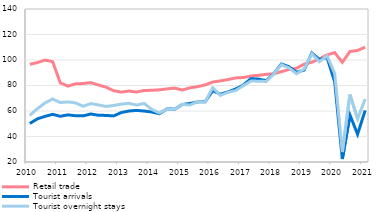
| Category | Retail trade  | Tourist arrivals  | Tourist overnight stays  |
|---|---|---|---|
| 2010 | 96.647 | 50.221 | 56.611 |
| II | 97.979 | 53.848 | 61.89 |
| III | 99.953 | 55.818 | 66.339 |
| IV | 98.675 | 57.383 | 69.417 |
| 2011 | 82.065 | 55.872 | 66.617 |
| II | 79.506 | 56.975 | 67.135 |
| III | 81.313 | 56.277 | 66.349 |
| IV | 81.537 | 56.193 | 63.741 |
| 2012 | 82.245 | 57.646 | 65.806 |
| II | 80.392 | 56.675 | 64.748 |
| III | 78.676 | 56.525 | 63.57 |
| IV | 75.906 | 56.144 | 64.34 |
| 2013 | 74.806 | 58.784 | 65.396 |
| II | 75.658 | 59.991 | 66.041 |
| III | 74.888 | 60.471 | 64.66 |
| IV | 76.086 | 59.97 | 65.949 |
| 2014 | 76.235 | 59.201 | 61.238 |
| II | 76.606 | 57.898 | 58.474 |
| III | 77.333 | 61.576 | 61.458 |
| IV | 77.952 | 61.443 | 61.428 |
| 2015 | 76.479 | 65.077 | 65.151 |
| II | 78.141 | 65.893 | 64.725 |
| III | 79.101 | 67.139 | 67.274 |
| IV | 80.433 | 67.243 | 67.051 |
| 2016 | 82.735 | 75.916 | 78.308 |
| II | 83.614 | 73.201 | 72.309 |
| III | 84.661 | 74.958 | 74.616 |
| IV | 85.932 | 77.245 | 76.031 |
| 2017 | 86.267 | 80.25 | 79.78 |
| II | 87.417 | 85.36 | 83.456 |
| III | 88.005 | 85.023 | 83.416 |
| IV | 88.727 | 83.751 | 83.168 |
| 2018 | 89.203 | 89.159 | 88.948 |
| II | 90.829 | 96.861 | 96.327 |
| III | 92.551 | 94.737 | 93.85 |
| IV | 93.546 | 90.399 | 89.25 |
| 2019 | 96.779 | 92.12 | 93.016 |
| II | 98.287 | 105.561 | 105.001 |
| III | 100.909 | 100.321 | 98.707 |
| IV | 104.024 | 101.999 | 103.276 |
| 2020 | 105.828 | 82.825 | 89.36 |
| II | 98.178 | 22.312 | 27.824 |
| III | 106.681 | 56.857 | 72.892 |
| IV | 107.442 | 41.802 | 53.87 |
| 2021 | 110.102 | 60.521 | 69.38 |